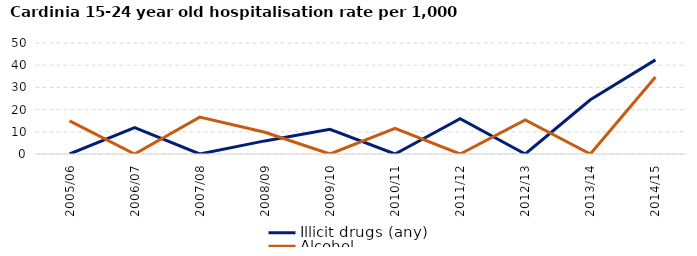
| Category | Illicit drugs (any) | Alcohol |
|---|---|---|
| 2005/06 | 0 | 14.9 |
| 2006/07 | 11.9 | 0 |
| 2007/08 | 0 | 16.6 |
| 2008/09 | 5.9 | 9.8 |
| 2009/10 | 11.1 | 0 |
| 2010/11 | 0 | 11.5 |
| 2011/12 | 15.9 | 0 |
| 2012/13 | 0 | 15.3 |
| 2013/14 | 24.4 | 0 |
| 2014/15 | 42.4 | 34.7 |